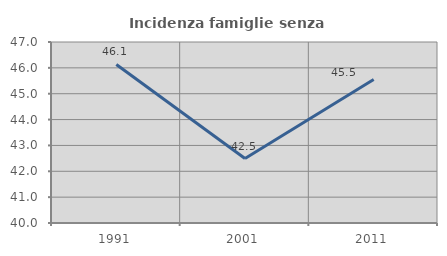
| Category | Incidenza famiglie senza nuclei |
|---|---|
| 1991.0 | 46.13 |
| 2001.0 | 42.493 |
| 2011.0 | 45.547 |